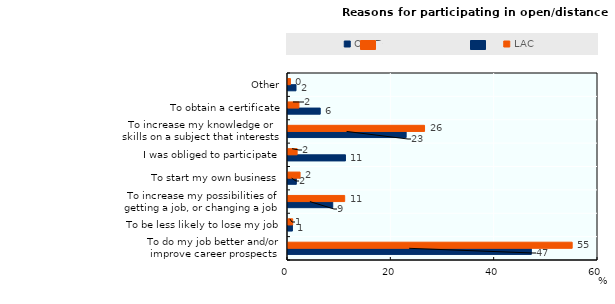
| Category | OECD | LAC |
|---|---|---|
| To do my job better and/or improve career prospects | 47.097 | 55.003 |
| To be less likely to lose my job | 0.856 | 0.91 |
| To increase my possibilities of getting a job, or changing a job or profession | 8.657 | 10.97 |
| To start my own business | 1.614 | 2.335 |
| I was obliged to participate | 11.122 | 1.768 |
| To increase my knowledge or skills on a subject that interests me | 22.869 | 26.428 |
| To obtain a certificate | 6.236 | 2.115 |
| Other | 1.549 | 0.47 |